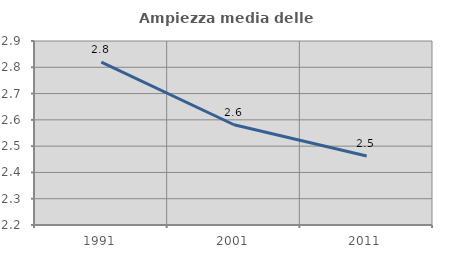
| Category | Ampiezza media delle famiglie |
|---|---|
| 1991.0 | 2.82 |
| 2001.0 | 2.581 |
| 2011.0 | 2.463 |